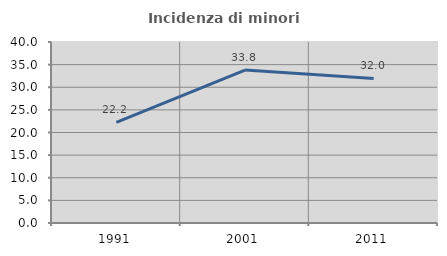
| Category | Incidenza di minori stranieri |
|---|---|
| 1991.0 | 22.222 |
| 2001.0 | 33.793 |
| 2011.0 | 31.95 |